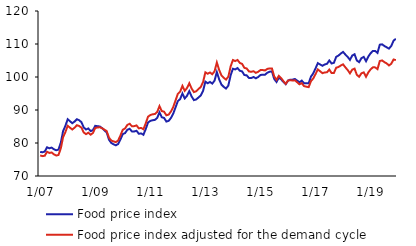
| Category | Food price index | Food price index adjusted for the demand cycle |
|---|---|---|
|  1/07 | 77.3 | 76.237 |
| 2 | 77.2 | 76.023 |
| 3 | 77.4 | 76.141 |
| 4 | 78.7 | 77.344 |
| 5 | 78.4 | 76.988 |
| 6 | 78.6 | 77.125 |
| 7 | 78.1 | 76.563 |
| 8 | 77.8 | 76.208 |
| 9 | 78 | 76.371 |
| 10 | 80.1 | 78.37 |
| 11 | 83.6 | 81.759 |
| 12 | 85.2 | 83.306 |
|  1/08 | 87.2 | 85.216 |
| 2 | 86.6 | 84.638 |
| 3 | 86 | 84.095 |
| 4 | 86.5 | 84.632 |
| 5 | 87.2 | 85.381 |
| 6 | 86.9 | 85.152 |
| 7 | 86.3 | 84.658 |
| 8 | 84.7 | 83.169 |
| 9 | 84.1 | 82.688 |
| 10 | 84.4 | 83.122 |
| 11 | 83.6 | 82.518 |
| 12 | 83.9 | 83.019 |
|  1/09 | 85.2 | 84.559 |
| 2 | 85.1 | 84.69 |
| 3 | 85 | 84.777 |
| 4 | 84.5 | 84.458 |
| 5 | 83.8 | 84.049 |
| 6 | 83.2 | 83.609 |
| 7 | 81 | 81.598 |
| 8 | 80 | 80.75 |
| 9 | 79.6 | 80.475 |
| 10 | 79.3 | 80.269 |
| 11 | 79.7 | 80.781 |
| 12 | 81.1 | 82.297 |
|  1/10 | 82.7 | 84.018 |
| 2 | 83 | 84.406 |
| 3 | 84 | 85.491 |
| 4 | 84.3 | 85.834 |
| 5 | 83.5 | 85.067 |
| 6 | 83.5 | 85.115 |
| 7 | 83.7 | 85.326 |
| 8 | 82.8 | 84.437 |
| 9 | 82.9 | 84.571 |
| 10 | 82.5 | 84.167 |
| 11 | 84.2 | 85.917 |
| 12 | 86.2 | 87.959 |
|  1/11 | 86.7 | 88.47 |
| 2 | 86.9 | 88.689 |
| 3 | 87 | 88.793 |
| 4 | 87.6 | 89.405 |
| 5 | 89.3 | 91.171 |
| 6 | 87.8 | 89.674 |
| 7 | 87.6 | 89.489 |
| 8 | 86.5 | 88.397 |
| 9 | 86.7 | 88.606 |
| 10 | 87.6 | 89.556 |
| 11 | 88.9 | 90.919 |
| 12 | 90.8 | 92.898 |
|  1/12 | 92.7 | 94.895 |
| 2 | 93.3 | 95.548 |
| 3 | 95 | 97.31 |
| 4 | 93.5 | 95.809 |
| 5 | 94.3 | 96.665 |
| 6 | 95.7 | 98.105 |
| 7 | 94.1 | 96.514 |
| 8 | 93 | 95.424 |
| 9 | 93.2 | 95.682 |
| 10 | 93.8 | 96.354 |
| 11 | 94.4 | 96.993 |
| 12 | 95.8 | 98.485 |
|  1/13 | 98.6 | 101.421 |
| 2 | 98.1 | 100.982 |
| 3 | 98.5 | 101.369 |
| 4 | 98 | 100.835 |
| 5 | 98.9 | 101.741 |
| 6 | 101.5 | 104.395 |
| 7 | 99.3 | 102.147 |
| 8 | 97.7 | 100.486 |
| 9 | 97 | 99.748 |
| 10 | 96.5 | 99.215 |
| 11 | 97.4 | 100.087 |
| 12 | 100.5 | 103.196 |
|  1/14 | 102.5 | 105.152 |
| 2 | 102.3 | 104.828 |
| 3 | 102.7 | 105.17 |
| 4 | 101.9 | 104.272 |
| 5 | 101.7 | 103.97 |
| 6 | 100.6 | 102.764 |
| 7 | 100.5 | 102.583 |
| 8 | 99.7 | 101.688 |
| 9 | 99.7 | 101.575 |
| 10 | 100 | 101.747 |
| 11 | 99.6 | 101.255 |
| 12 | 100 | 101.583 |
|  1/15 | 100.6 | 102.096 |
| 2 | 100.7 | 102.1 |
| 3 | 100.7 | 101.984 |
| 4 | 101.3 | 102.457 |
| 5 | 101.6 | 102.605 |
| 6 | 101.7 | 102.6 |
| 7 | 99.4 | 100.165 |
| 8 | 98.5 | 99.144 |
| 9 | 99.8 | 100.337 |
| 10 | 99.3 | 99.669 |
| 11 | 98.5 | 98.745 |
| 12 | 97.8 | 97.946 |
|  1/16 | 98.9 | 98.902 |
| 2 | 99.2 | 99.051 |
| 3 | 99.2 | 98.931 |
| 4 | 99.4 | 98.999 |
| 5 | 98.9 | 98.402 |
| 6 | 98.4 | 97.793 |
| 7 | 98.9 | 98.16 |
| 8 | 98.1 | 97.236 |
| 9 | 98.1 | 97.072 |
| 10 | 98.1 | 96.921 |
| 11 | 100.1 | 98.728 |
| 12 | 101.1 | 99.559 |
|  1/17 | 102.6 | 100.88 |
| 2 | 104.2 | 102.296 |
| 3 | 103.8 | 101.746 |
| 4 | 103.4 | 101.164 |
| 5 | 103.8 | 101.378 |
| 6 | 104 | 101.431 |
| 7 | 105 | 102.251 |
| 8 | 104.1 | 101.202 |
| 9 | 104.3 | 101.221 |
| 10 | 106.1 | 102.807 |
| 11 | 106.5 | 103.035 |
| 12 | 107.1 | 103.474 |
|  1/18 | 107.6 | 103.834 |
| 2 | 106.8 | 102.925 |
| 3 | 106.1 | 102.114 |
| 4 | 105.2 | 101.111 |
| 5 | 106.5 | 102.223 |
| 6 | 106.9 | 102.538 |
| 7 | 105 | 100.655 |
| 8 | 104.5 | 100.068 |
| 9 | 105.7 | 101.118 |
| 10 | 106.1 | 101.403 |
| 11 | 104.8 | 100.081 |
| 12 | 106.2 | 101.374 |
|  1/19 | 107.2 | 102.305 |
| 2 | 107.9 | 102.936 |
| 3 | 107.9 | 102.914 |
| 4 | 107.3 | 102.39 |
| 5 | 109.8 | 104.835 |
| 6 | 109.9 | 105.026 |
| 7 | 109.4 | 104.507 |
| 8 | 109 | 104.121 |
| 9 | 108.6 | 103.502 |
| 10 | 109.4 | 104.026 |
| 11 | 111 | 105.306 |
| 12 | 111.6 | 105.106 |